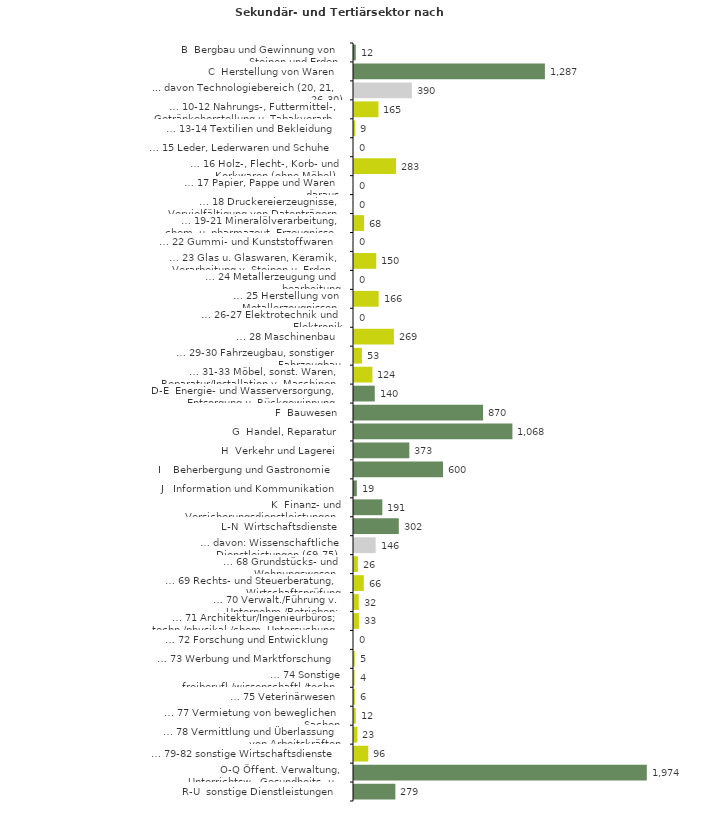
| Category | Series 0 |
|---|---|
| B  Bergbau und Gewinnung von Steinen und Erden | 12 |
| C  Herstellung von Waren | 1287 |
| ... davon Technologiebereich (20, 21, 26-30) | 390 |
| … 10-12 Nahrungs-, Futtermittel-, Getränkeherstellung u. Tabakverarb. | 165 |
| … 13-14 Textilien und Bekleidung | 9 |
| … 15 Leder, Lederwaren und Schuhe | 0 |
| … 16 Holz-, Flecht-, Korb- und Korkwaren (ohne Möbel)  | 283 |
| … 17 Papier, Pappe und Waren daraus  | 0 |
| … 18 Druckereierzeugnisse, Vervielfältigung von Datenträgern | 0 |
| … 19-21 Mineralölverarbeitung, chem. u. pharmazeut. Erzeugnisse | 68 |
| … 22 Gummi- und Kunststoffwaren | 0 |
| … 23 Glas u. Glaswaren, Keramik, Verarbeitung v. Steinen u. Erden  | 150 |
| … 24 Metallerzeugung und -bearbeitung | 0 |
| … 25 Herstellung von Metallerzeugnissen  | 166 |
| … 26-27 Elektrotechnik und Elektronik | 0 |
| … 28 Maschinenbau | 269 |
| … 29-30 Fahrzeugbau, sonstiger Fahrzeugbau | 53 |
| … 31-33 Möbel, sonst. Waren, Reparatur/Installation v. Maschinen | 124 |
| D-E  Energie- und Wasserversorgung, Entsorgung u. Rückgewinnung | 140 |
| F  Bauwesen | 870 |
| G  Handel, Reparatur | 1068 |
| H  Verkehr und Lagerei | 373 |
| I    Beherbergung und Gastronomie | 600 |
| J   Information und Kommunikation | 19 |
| K  Finanz- und Versicherungsdienstleistungen | 191 |
| L-N  Wirtschaftsdienste | 302 |
| … davon: Wissenschaftliche Dienstleistungen (69-75) | 146 |
| … 68 Grundstücks- und Wohnungswesen  | 26 |
| … 69 Rechts- und Steuerberatung, Wirtschaftsprüfung | 66 |
| … 70 Verwalt./Führung v. Unternehm./Betrieben; Unternehmensberat. | 32 |
| … 71 Architektur/Ingenieurbüros; techn./physikal./chem. Untersuchung | 33 |
| … 72 Forschung und Entwicklung  | 0 |
| … 73 Werbung und Marktforschung | 5 |
| … 74 Sonstige freiberufl./wissenschaftl./techn. Tätigkeiten | 4 |
| … 75 Veterinärwesen | 6 |
| … 77 Vermietung von beweglichen Sachen  | 12 |
| … 78 Vermittlung und Überlassung von Arbeitskräften | 23 |
| … 79-82 sonstige Wirtschaftsdienste | 96 |
| O-Q Öffent. Verwaltung, Unterrichtsw., Gesundheits- u. Sozialwesen | 1974 |
| R-U  sonstige Dienstleistungen | 279 |